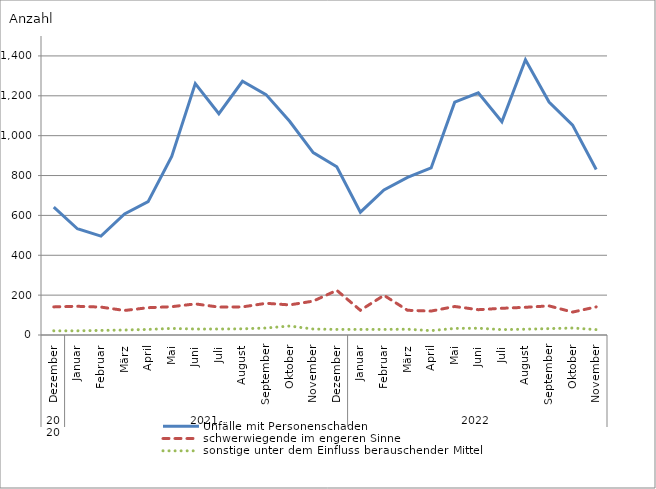
| Category | Unfälle mit Personenschaden | schwerwiegende im engeren Sinne | sonstige unter dem Einfluss berauschender Mittel |
|---|---|---|---|
| 0 | 642 | 141 | 21 |
| 1 | 533 | 144 | 21 |
| 2 | 496 | 140 | 23 |
| 3 | 607 | 123 | 25 |
| 4 | 669 | 137 | 28 |
| 5 | 896 | 142 | 33 |
| 6 | 1261 | 156 | 30 |
| 7 | 1110 | 140 | 30 |
| 8 | 1273 | 141 | 31 |
| 9 | 1206 | 159 | 35 |
| 10 | 1072 | 151 | 45 |
| 11 | 915 | 170 | 30 |
| 12 | 844 | 224 | 28 |
| 13 | 616 | 124 | 28 |
| 14 | 728 | 199 | 28 |
| 15 | 791 | 124 | 29 |
| 16 | 838 | 120 | 22 |
| 17 | 1168 | 143 | 33 |
| 18 | 1215 | 127 | 34 |
| 19 | 1070 | 134 | 27 |
| 20 | 1381 | 139 | 29 |
| 21 | 1169 | 146 | 32 |
| 22 | 1053 | 115 | 35 |
| 23 | 830 | 141 | 27 |